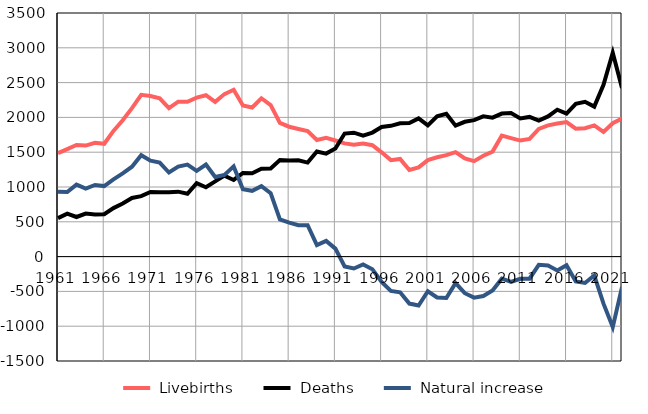
| Category |  Livebirths |  Deaths |  Natural increase |
|---|---|---|---|
| 1961.0 | 1486 | 553 | 933 |
| 1962.0 | 1545 | 617 | 928 |
| 1963.0 | 1603 | 569 | 1034 |
| 1964.0 | 1595 | 618 | 977 |
| 1965.0 | 1635 | 606 | 1029 |
| 1966.0 | 1621 | 608 | 1013 |
| 1967.0 | 1806 | 697 | 1109 |
| 1968.0 | 1958 | 762 | 1196 |
| 1969.0 | 2133 | 842 | 1291 |
| 1970.0 | 2325 | 868 | 1457 |
| 1971.0 | 2308 | 929 | 1379 |
| 1972.0 | 2274 | 923 | 1351 |
| 1973.0 | 2132 | 924 | 1208 |
| 1974.0 | 2226 | 933 | 1293 |
| 1975.0 | 2224 | 902 | 1322 |
| 1976.0 | 2285 | 1054 | 1231 |
| 1977.0 | 2319 | 996 | 1323 |
| 1978.0 | 2223 | 1080 | 1143 |
| 1979.0 | 2335 | 1163 | 1172 |
| 1980.0 | 2397 | 1101 | 1296 |
| 1981.0 | 2170 | 1201 | 969 |
| 1982.0 | 2142 | 1197 | 945 |
| 1983.0 | 2275 | 1262 | 1013 |
| 1984.0 | 2177 | 1265 | 912 |
| 1985.0 | 1920 | 1386 | 534 |
| 1986.0 | 1866 | 1379 | 487 |
| 1987.0 | 1834 | 1383 | 451 |
| 1988.0 | 1803 | 1351 | 452 |
| 1989.0 | 1675 | 1509 | 166 |
| 1990.0 | 1706 | 1480 | 226 |
| 1991.0 | 1668 | 1553 | 115 |
| 1992.0 | 1627 | 1768 | -141 |
| 1993.0 | 1609 | 1780 | -171 |
| 1994.0 | 1626 | 1739 | -113 |
| 1995.0 | 1601 | 1782 | -181 |
| 1996.0 | 1498 | 1862 | -364 |
| 1997.0 | 1386 | 1879 | -493 |
| 1998.0 | 1403 | 1916 | -513 |
| 1999.0 | 1245 | 1920 | -675 |
| 2000.0 | 1282 | 1985 | -703 |
| 2001.0 | 1387 | 1885 | -498 |
| 2002.0 | 1427 | 2015 | -588 |
| 2003.0 | 1457 | 2052 | -595 |
| 2004.0 | 1501 | 1882 | -381 |
| 2005.0 | 1411 | 1937 | -526 |
| 2006.0 | 1371 | 1961 | -590 |
| 2007.0 | 1449 | 2016 | -567 |
| 2008.0 | 1509 | 1997 | -488 |
| 2009.0 | 1738 | 2055 | -317 |
| 2010.0 | 1702 | 2064 | -362 |
| 2011.0 | 1667 | 1986 | -319 |
| 2012.0 | 1690 | 2007 | -317 |
| 2013.0 | 1835 | 1953 | -118 |
| 2014.0 | 1885 | 2014 | -129 |
| 2015.0 | 1912 | 2111 | -199 |
| 2016.0 | 1933 | 2056 | -123 |
| 2017.0 | 1838 | 2196 | -358 |
| 2018.0 | 1845 | 2224 | -379 |
| 2019.0 | 1885 | 2155 | -270 |
| 2020.0 | 1792 | 2468 | -676 |
| 2021.0 | 1916 | 2929 | -1013 |
| 2022.0 | 1984 | 2422 | -438 |